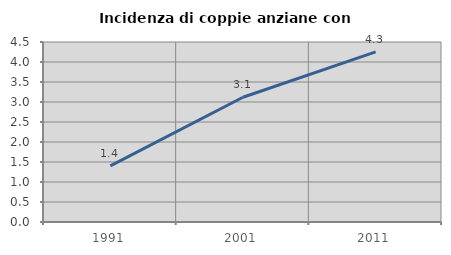
| Category | Incidenza di coppie anziane con figli |
|---|---|
| 1991.0 | 1.402 |
| 2001.0 | 3.119 |
| 2011.0 | 4.253 |